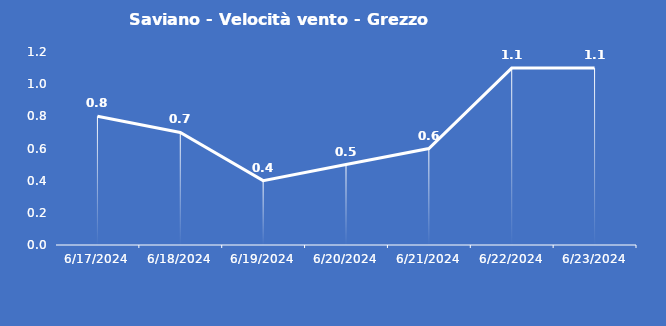
| Category | Saviano - Velocità vento - Grezzo (m/s) |
|---|---|
| 6/17/24 | 0.8 |
| 6/18/24 | 0.7 |
| 6/19/24 | 0.4 |
| 6/20/24 | 0.5 |
| 6/21/24 | 0.6 |
| 6/22/24 | 1.1 |
| 6/23/24 | 1.1 |